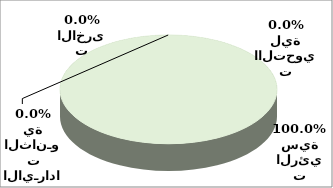
| Category | Series 0 |
|---|---|
| الايرادات الرئيسية | 90698071 |
| الايـرادات الثانـوية | 3014 |
| الايرادات االتحويلية | 0 |
| الايرادات الاخرى | 38122 |